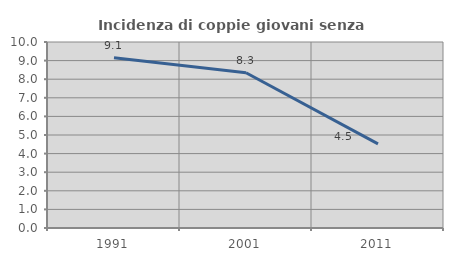
| Category | Incidenza di coppie giovani senza figli |
|---|---|
| 1991.0 | 9.148 |
| 2001.0 | 8.344 |
| 2011.0 | 4.524 |